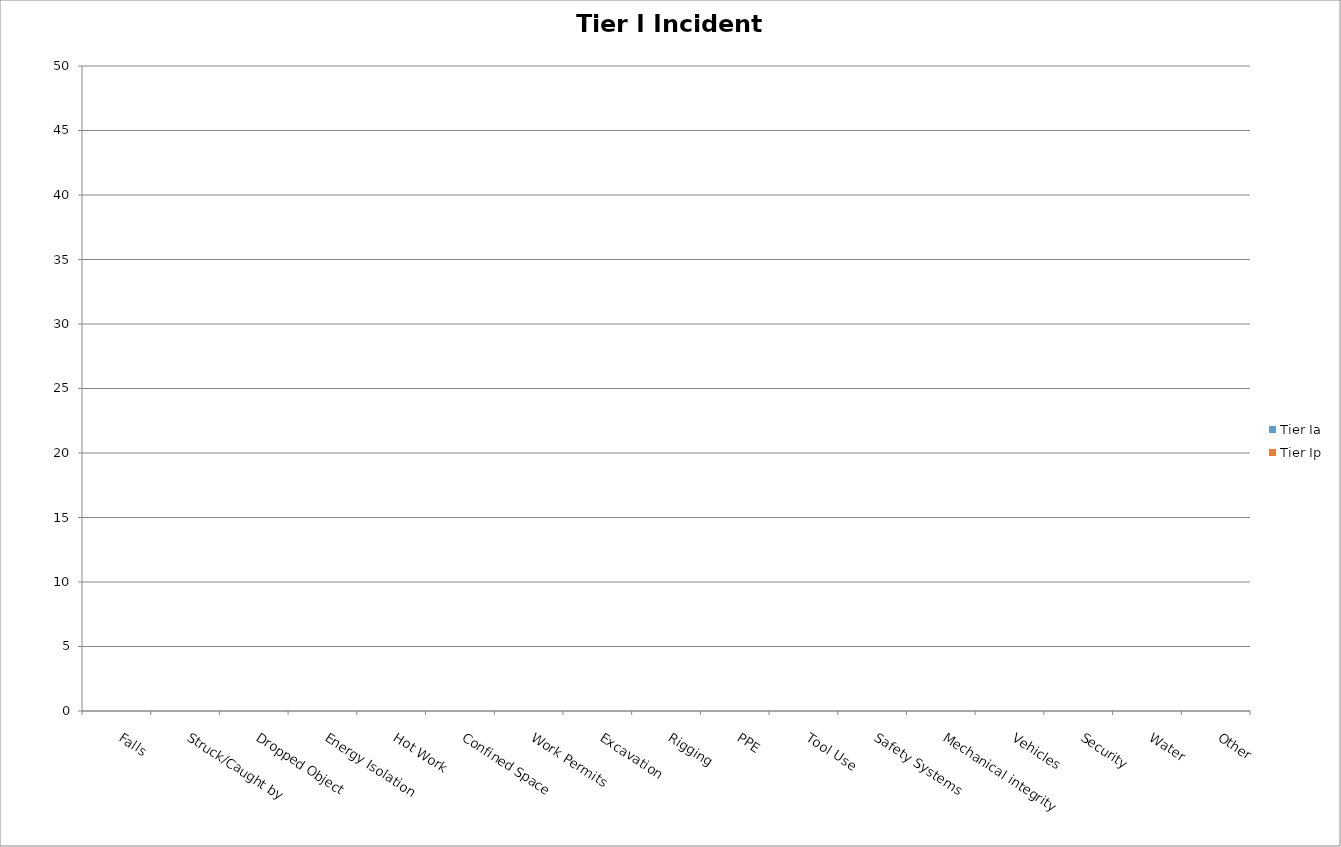
| Category | Tier Ia | Tier Ip |
|---|---|---|
| Falls | 0 | 0 |
| Struck/Caught by | 0 | 0 |
| Dropped Object | 0 | 0 |
| Energy Isolation | 0 | 0 |
| Hot Work | 0 | 0 |
| Confined Space | 0 | 0 |
| Work Permits | 0 | 0 |
| Excavation | 0 | 0 |
| Rigging | 0 | 0 |
| PPE | 0 | 0 |
| Tool Use | 0 | 0 |
| Safety Systems | 0 | 0 |
| Mechanical integrity | 0 | 0 |
| Vehicles | 0 | 0 |
| Security | 0 | 0 |
| Water | 0 | 0 |
| Other | 0 | 0 |